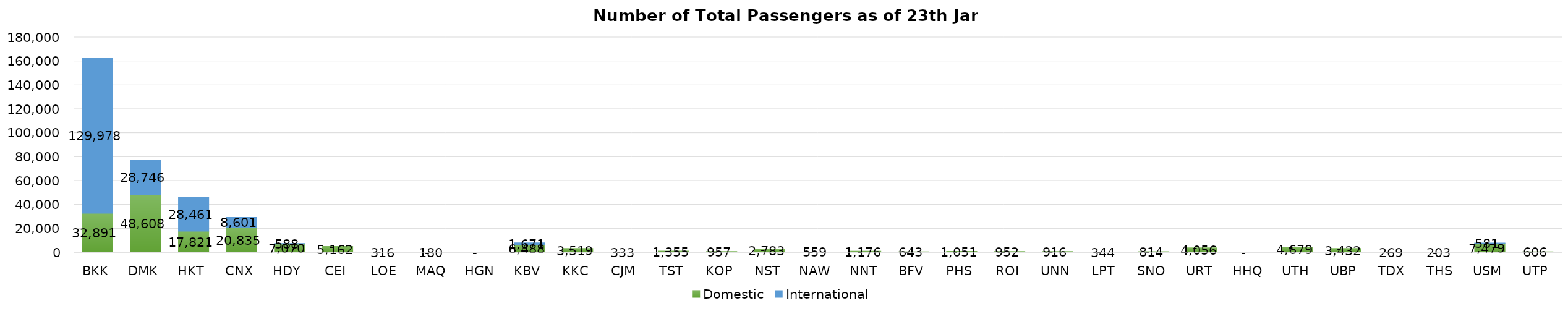
| Category | Domestic | International |
|---|---|---|
| BKK | 32891 | 129978 |
| DMK | 48608 | 28746 |
| HKT | 17821 | 28461 |
| CNX | 20835 | 8601 |
| HDY | 7070 | 588 |
| CEI | 5162 | 0 |
| LOE | 316 | 0 |
| MAQ | 180 | 0 |
| HGN | 0 | 0 |
| KBV | 6488 | 1671 |
| KKC | 3519 | 0 |
| CJM | 333 | 0 |
| TST | 1355 | 0 |
| KOP | 957 | 0 |
| NST | 2783 | 0 |
| NAW | 559 | 0 |
| NNT | 1176 | 0 |
| BFV | 643 | 0 |
| PHS | 1051 | 0 |
| ROI | 952 | 0 |
| UNN | 916 | 0 |
| LPT | 344 | 0 |
| SNO | 814 | 0 |
| URT | 4056 | 0 |
| HHQ | 0 | 0 |
| UTH | 4679 | 0 |
| UBP | 3432 | 0 |
| TDX | 269 | 0 |
| THS | 203 | 0 |
| USM | 7479 | 581 |
| UTP | 606 | 0 |